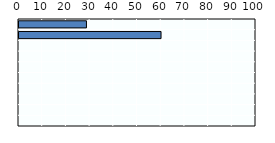
| Category | Payment rate (%) |
|---|---|
| Korea | 28.461 |
| Japan | 59.935 |
| OECD average (d) | 0 |
| Australia | 0 |
| China | 0 |
| Hong Kong (China) | 0 |
| New Zealand | 0 |
| Singapore | 0 |
| Thailand | 0 |
| Viet Nam | 0 |